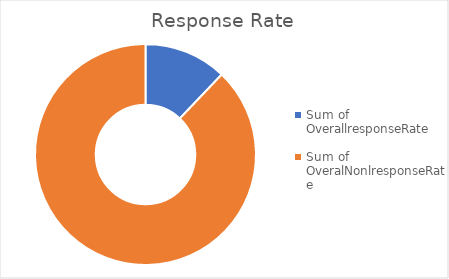
| Category | Total |
|---|---|
| Sum of OverallresponseRate | 12.121 |
| Sum of OveralNonlresponseRate | 87.879 |